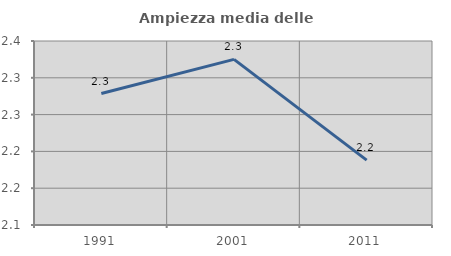
| Category | Ampiezza media delle famiglie |
|---|---|
| 1991.0 | 2.279 |
| 2001.0 | 2.325 |
| 2011.0 | 2.188 |